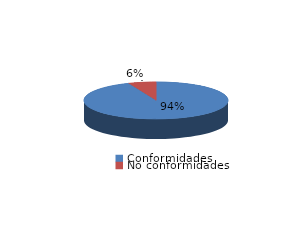
| Category | Series 0 |
|---|---|
| Conformidades | 1468 |
| No conformidades | 97 |